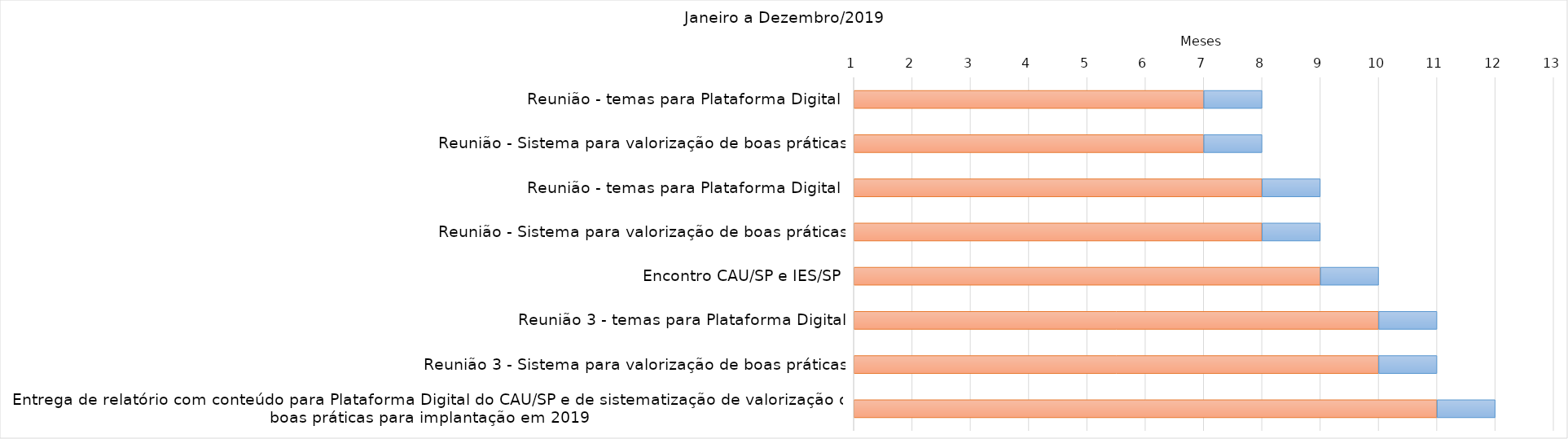
| Category | B Início | C Duração |
|---|---|---|
| Reunião - temas para Plataforma Digital  | 7 | 1 |
| Reunião - Sistema para valorização de boas práticas | 7 | 1 |
| Reunião - temas para Plataforma Digital  | 8 | 1 |
| Reunião - Sistema para valorização de boas práticas | 8 | 1 |
| Encontro CAU/SP e IES/SP | 9 | 1 |
| Reunião 3 - temas para Plataforma Digital | 10 | 1 |
| Reunião 3 - Sistema para valorização de boas práticas | 10 | 1 |
| Entrega de relatório com conteúdo para Plataforma Digital do CAU/SP e de sistematização de valorização de boas práticas para implantação em 2019 | 11 | 1 |